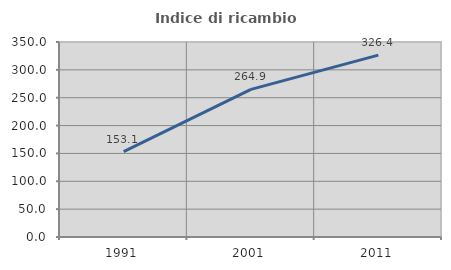
| Category | Indice di ricambio occupazionale  |
|---|---|
| 1991.0 | 153.097 |
| 2001.0 | 264.894 |
| 2011.0 | 326.364 |